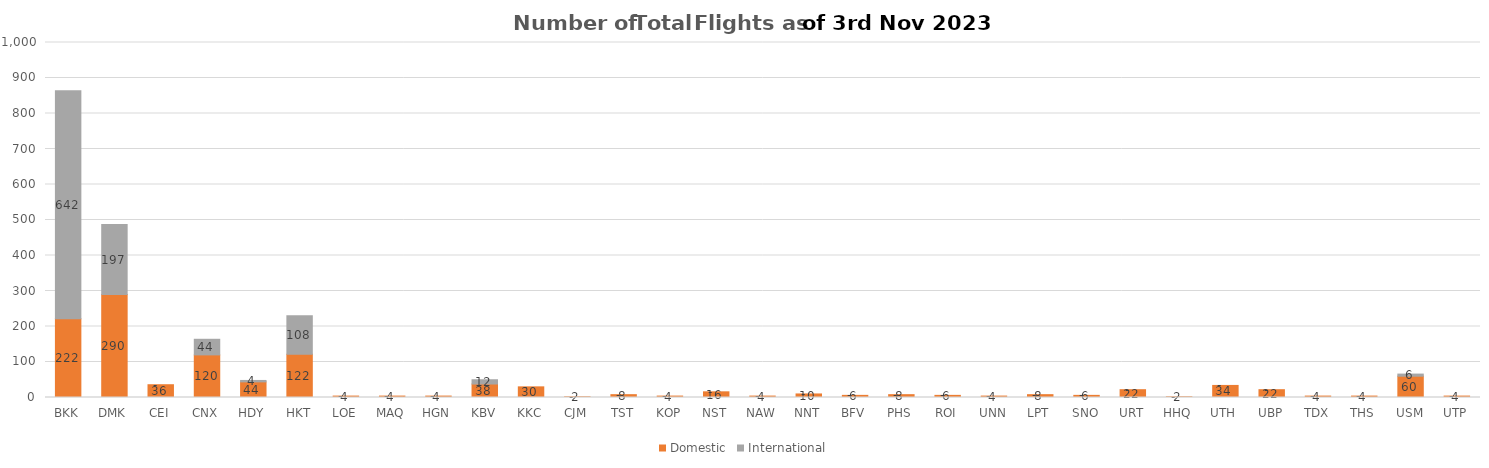
| Category | Domestic | International |
|---|---|---|
| BKK | 222 | 642 |
| DMK | 290 | 197 |
| CEI | 36 | 0 |
| CNX | 120 | 44 |
| HDY | 44 | 4 |
| HKT | 122 | 108 |
| LOE | 4 | 0 |
| MAQ | 4 | 0 |
| HGN | 4 | 0 |
| KBV | 38 | 12 |
| KKC | 30 | 0 |
| CJM | 2 | 0 |
| TST | 8 | 0 |
| KOP | 4 | 0 |
| NST | 16 | 0 |
| NAW | 4 | 0 |
| NNT | 10 | 0 |
| BFV | 6 | 0 |
| PHS | 8 | 0 |
| ROI | 6 | 0 |
| UNN | 4 | 0 |
| LPT | 8 | 0 |
| SNO | 6 | 0 |
| URT | 22 | 0 |
| HHQ | 2 | 0 |
| UTH | 34 | 0 |
| UBP | 22 | 0 |
| TDX | 4 | 0 |
| THS | 4 | 0 |
| USM | 60 | 6 |
| UTP | 4 | 0 |